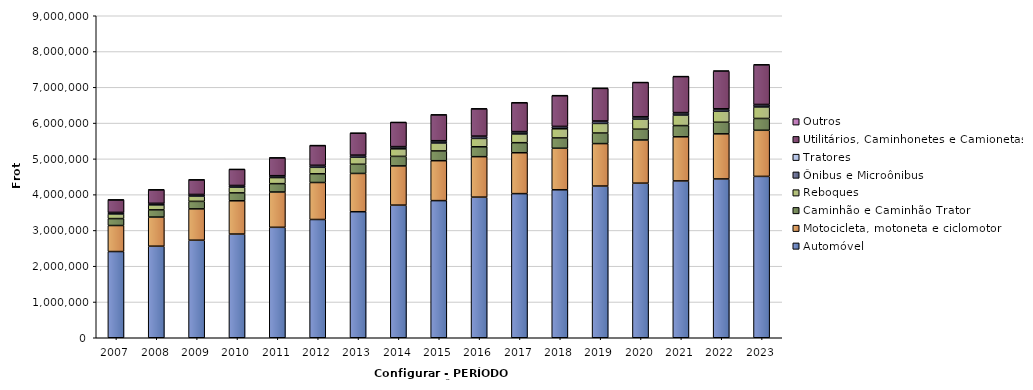
| Category | Automóvel | Motocicleta, motoneta e ciclomotor | Caminhão e Caminhão Trator | Reboques | Ônibus e Microônibus | Tratores | Utilitários, Caminhonetes e Camionetas | Outros |
|---|---|---|---|---|---|---|---|---|
| 2007 | 2409653 | 727725 | 193318 | 129984 | 39996 | 3400 | 349167 | 1972 |
| 2008 | 2559453 | 813776 | 201533 | 138889 | 40419 | 3858 | 376126 | 4496 |
| 2009 | 2726795 | 875494 | 209640 | 147151 | 42164 | 4300 | 407545 | 4557 |
| 2010 | 2898284 | 929824 | 221179 | 157643 | 44521 | 5113 | 448341 | 4709 |
| 2011 | 3086934 | 986762 | 233363 | 169490 | 47641 | 5869 | 496926 | 4946 |
| 2012 | 3305134 | 1033842 | 243366 | 181801 | 50219 | 6498 | 550216 | 5226 |
| 2013 | 3522607 | 1069708 | 256447 | 196601 | 52923 | 6880 | 611265 | 5473 |
| 2014 | 3707055 | 1095707 | 266995 | 210784 | 55119 | 7178 | 675150 | 5708 |
| 2015 | 3832828 | 1115776 | 272515 | 222823 | 56413 | 7437 | 721048 | 5930 |
| 2016 | 3930356 | 1130996 | 276645 | 233668 | 57228 | 7603 | 760928 | 6118 |
| 2017 | 4028444 | 1142793 | 281048 | 244670 | 57714 | 7735 | 806015 | 6281 |
| 2018 | 4135423 | 1161934 | 287508 | 256231 | 58822 | 7926 | 858483 | 6437 |
| 2019 | 4240842 | 1186315 | 295115 | 268316 | 59946 | 8188 | 911804 | 7078 |
| 2020 | 4321142 | 1206638 | 301846 | 280206 | 60075 | 8396 | 954827 | 7888 |
| 2021 | 4383723 | 1233254 | 313043 | 294912 | 59909 | 8634 | 1005580 | 9147 |
| 2022 | 4439074 | 1260509 | 323306 | 308010 | 60247 | 8903 | 1051450 | 10390 |
| 2023 | 4510200 | 1288801 | 330348 | 321809 | 60600 | 9203 | 1105471 | 11427 |